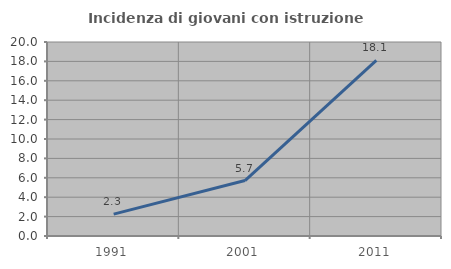
| Category | Incidenza di giovani con istruzione universitaria |
|---|---|
| 1991.0 | 2.26 |
| 2001.0 | 5.714 |
| 2011.0 | 18.103 |